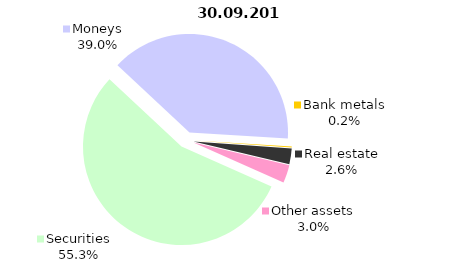
| Category | 30.09.2019 |
|---|---|
| Securities | 1643.3 |
| Moneys | 1160.3 |
| Bank metals | 5 |
| Real estate | 76 |
| Other assets | 88.1 |